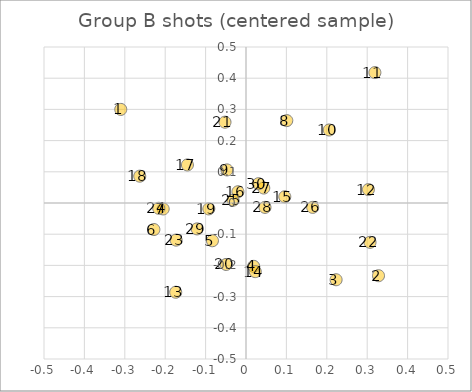
| Category | Series 0 |
|---|---|
| -0.31000000000000005 | 0.3 |
| 0.32800000000000007 | -0.233 |
| 0.2230000000000001 | -0.246 |
| 0.018999999999999906 | -0.203 |
| -0.08299999999999996 | -0.121 |
| -0.22799999999999998 | -0.085 |
| -0.20500000000000007 | -0.019 |
| 0.10099999999999998 | 0.264 |
| -0.04699999999999993 | 0.106 |
| 0.20599999999999996 | 0.234 |
| 0.31899999999999995 | 0.418 |
| 0.30299999999999994 | 0.043 |
| -0.17400000000000038 | -0.286 |
| 0.022999999999999687 | -0.22 |
| 0.09599999999999964 | 0.02 |
| -0.020000000000000018 | 0.036 |
| -0.14500000000000002 | 0.122 |
| -0.26300000000000034 | 0.086 |
| -0.09200000000000008 | -0.019 |
| -0.04900000000000038 | -0.197 |
| -0.0519999999999996 | 0.259 |
| 0.3070000000000004 | -0.126 |
| -0.17300000000000004 | -0.119 |
| -0.2160000000000002 | -0.017 |
| -0.03200000000000003 | 0.009 |
| 0.16500000000000004 | -0.014 |
| 0.043999999999999595 | 0.048 |
| 0.04699999999999971 | -0.014 |
| -0.12099999999999955 | -0.083 |
| 0.030999999999999694 | 0.062 |